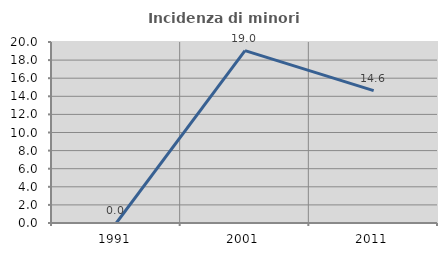
| Category | Incidenza di minori stranieri |
|---|---|
| 1991.0 | 0 |
| 2001.0 | 19.048 |
| 2011.0 | 14.634 |